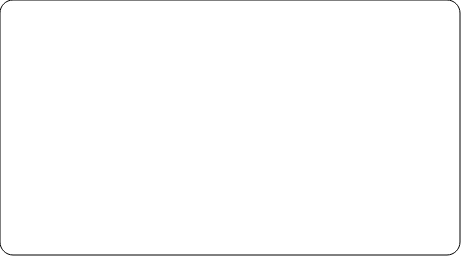
| Category | Series 0 |
|---|---|
| Fin de PE par le salarié | 0 |
| Démission | 0 |
| Départ en retraite | 0 |
| Fin de PE par l'employeur | 0 |
| Licenciement | 0 |
| Mise à la retraite | 0 |
| Rupture conventionnelle | 0 |
| Décès | 0 |